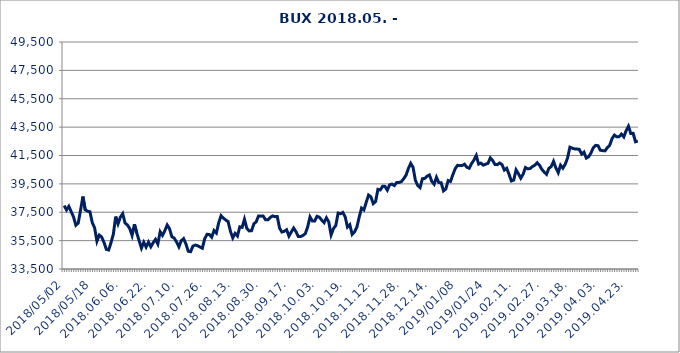
| Category | Series 0 |
|---|---|
| 2018.05.02 | 37969.837 |
| 2018.05.03 | 37660.989 |
| 2018.05.04 | 37916.311 |
| 2018.05.07 | 37541.327 |
| 2018.05.08 | 37164.546 |
| 2018.05.09 | 36588.258 |
| 2018.05.10 | 36740.211 |
| 2018.05.11 | 37644.061 |
| 2018.05.14 | 38602.887 |
| 2018.05.15 | 37663.784 |
| 2018.05.16 | 37574.99 |
| 2018.05.17 | 37538.045 |
| 2018.05.18 | 36770.927 |
| 2018.05.22 | 36400.772 |
| 2018.05.23 | 35456.518 |
| 2018.05.24 | 35892.617 |
| 2018.05.25 | 35758.06 |
| 2018.05.28 | 35373.587 |
| 2018.05.29 | 34883.939 |
| 2018.05.30 | 34837.126 |
| 2018.05.31 | 35356.826 |
| 2018.06.01. | 35952.676 |
| 2018.06.04. | 37194.372 |
| 2018.06.05. | 36677.561 |
| 2018.06.06. | 37157.464 |
| 2018.06.07. | 37401.246 |
| 2018.06.08. | 36738.315 |
| 2018.06.11. | 36606.384 |
| 2018.06.12. | 36348.106 |
| 2018.06.13. | 35868.589 |
| 2018.06.14. | 36654.567 |
| 2018.06.15. | 36038.956 |
| 2018.06.18. | 35505.465 |
| 2018.06.19. | 34972.348 |
| 2018.06.20. | 35383.574 |
| 2018.06.21. | 35049.552 |
| 2018.06.22. | 35396.618 |
| 2018.06.25. | 35064.749 |
| 2018.06.26. | 35352.026 |
| 2018.06.27. | 35587.462 |
| 2018.06.28. | 35258.852 |
| 2018.06.29. | 36127.708 |
| 2018.07.02. | 35867.746 |
| 2018.07.03. | 36204.299 |
| 2018.07.04. | 36600.249 |
| 2018.07.05. | 36335.094 |
| 2018.07.06. | 35775.734 |
| 2018.07.09. | 35676.821 |
| 2018.07.10. | 35403.198 |
| 2018.07.11. | 35063.073 |
| 2018.07.12. | 35485.868 |
| 2018.07.13. | 35641.757 |
| 2018.07.16. | 35267.069 |
| 2018.07.17. | 34751.127 |
| 2018.07.18. | 34720.307 |
| 2018.07.19. | 35117.829 |
| 2018.07.20. | 35186.519 |
| 2018.07.23. | 35141.027 |
| 2018.07.24. | 35049.71 |
| 2018.07.25. | 34963.193 |
| 2018.07.26. | 35624.912 |
| 2018.07.27. | 35943.642 |
| 2018.07.30. | 35931.234 |
| 2018.07.31. | 35742.058 |
| 2018.08.01. | 36207.717 |
| 2018.08.02. | 36035.461 |
| 2018.08.03. | 36760.004 |
| 2018.08.06. | 37259.801 |
| 2018.08.07. | 37087.753 |
| 2018.08.08. | 36954.164 |
| 2018.08.09. | 36844.993 |
| 2018.08.10. | 36171.258 |
| 2018.08.13. | 35693.828 |
| 2018.08.14. | 36006.196 |
| 2018.08.15. | 35826.141 |
| 2018.08.16. | 36472.99 |
| 2018.08.17. | 36436.959 |
| 2018.08.21. | 37007.662 |
| 2018.08.22. | 36365.904 |
| 2018.08.23. | 36186.315 |
| 2018.08.24. | 36192.132 |
| 2018.08.27. | 36685.79 |
| 2018.08.28. | 36818.931 |
| 2018.08.29. | 37234.858 |
| 2018.08.30. | 37225.076 |
| 2018.08.31. | 37233.402 |
| 2018.09.03. | 36971.856 |
| 2018.09.04. | 36968.107 |
| 2018.09.05. | 37135.328 |
| 2018.09.06. | 37241.816 |
| 2018.09.07. | 37189.976 |
| 2018.09.10. | 37202.889 |
| 2018.09.11. | 36371.943 |
| 2018.09.12. | 36104.073 |
| 2018.09.13. | 36156.035 |
| 2018.09.14. | 36269.166 |
| 2018.09.17. | 35819.9 |
| 2018.09.18. | 36110.885 |
| 2018.09.19. | 36386.403 |
| 2018.09.20. | 36134.329 |
| 2018.09.21. | 35783.48 |
| 2018.09.24. | 35786.545 |
| 2018.09.25. | 35868.88 |
| 2018.09.26. | 35996.041 |
| 2018.09.27. | 36471.348 |
| 2018.09.28. | 37171.414 |
| 2018.10.01. | 36883.492 |
| 2018.10.02. | 36876.748 |
| 2018.10.03. | 37212.945 |
| 2018.10.04. | 37146.727 |
| 2018.10.05. | 36945.25 |
| 2018.10.08. | 36768.023 |
| 2018.10.09. | 37109.241 |
| 2018.10.10. | 36821.117 |
| 2018.10.11. | 35904.542 |
| 2018.10.12. | 36347.89 |
| 2018.10.15. | 36564.15 |
| 2018.10.16. | 37445.673 |
| 2018.10.17. | 37399.11 |
| 2018.10.18. | 37485.015 |
| 2018.10.19. | 37185.929 |
| 2018.10.24. | 36452.736 |
| 2018.10.25. | 36617.542 |
| 2018.10.26. | 35937.614 |
| 2018.10.29. | 36110.122 |
| 2018.10.30. | 36444.725 |
| 2018.10.31. | 37155.206 |
| 2018.11.05. | 37794.87 |
| 2018.11.06. | 37666.001 |
| 2018.11.07. | 38197.997 |
| 2018.11.08. | 38713.446 |
| 2018.11.09. | 38586.627 |
| 2018.11.12. | 38108.455 |
| 2018.11.13. | 38252.647 |
| 2018.11.14. | 39115.558 |
| 2018.11.15. | 39070.967 |
| 2018.11.16. | 39328.386 |
| 2018.11.19. | 39323.012 |
| 2018.11.20. | 39058.304 |
| 2018.11.21. | 39431.33 |
| 2018.11.22. | 39489.376 |
| 2018.11.23. | 39379.776 |
| 2018.11.26. | 39598.286 |
| 2018.11.27. | 39601.698 |
| 2018.11.28. | 39656.246 |
| 2018.11.29. | 39861.634 |
| 2018.11.30. | 40109.366 |
| 2018.12.03. | 40579.822 |
| 2018.12.04. | 40945.474 |
| 2018.12.05. | 40670.445 |
| 2018.12.06. | 39747.127 |
| 2018.12.07. | 39384.556 |
| 2018.12.10. | 39238.436 |
| 2018.12.11. | 39860.234 |
| 2018.12.12. | 39887.22 |
| 2018.12.13. | 40041.705 |
| 2018.12.14. | 40125.722 |
| 2018.12.17. | 39675.759 |
| 2018.12.18. | 39475.607 |
| 2018.12.19. | 39966.192 |
| 2018.12.20. | 39592.675 |
| 2018.12.21. | 39578.632 |
| 2018.12.27. | 39006.517 |
| 2018.12.28. | 39138.949 |
| 2019.01.02 | 39734.064 |
| 2019.01.03 | 39672.597 |
| 2019.01.04 | 40145.177 |
| 2019.01.07 | 40569.468 |
| 2019.01.08 | 40809.819 |
| 2019.01.09 | 40784.268 |
| 2019.01.10 | 40795.505 |
| 2019.01.11 | 40886.064 |
| 2019.01.14 | 40667.654 |
| 2019.01.15 | 40600.26 |
| 2019.01.16 | 40933.043 |
| 2019.01.17 | 41180.049 |
| 2019.01.18 | 41503.905 |
| 2019.01.21 | 40893.713 |
| 2019.01.22 | 40963.712 |
| 2019.01.23 | 40818.686 |
| 2019.01.24 | 40890.939 |
| 2019.01.25 | 40944.824 |
| 2019.01.28 | 41332.315 |
| 2019.01.29 | 41146 |
| 2019.01.30 | 40862.967 |
| 2019.01.31 | 40855.561 |
| 2019.02.01. | 40973.34 |
| 2019.02.04. | 40856.968 |
| 2019.02.05. | 40474.394 |
| 2019.02.06. | 40597.263 |
| 2019.02.07. | 40173.726 |
| 2019.02.08. | 39704.61 |
| 2019.02.11. | 39769.479 |
| 2019.02.12. | 40488.09 |
| 2019.02.13. | 40221.18 |
| 2019.02.14. | 39898.653 |
| 2019.02.15. | 40179.836 |
| 2019.02.18. | 40653.387 |
| 2019.02.19. | 40560.444 |
| 2019.02.20. | 40582.832 |
| 2019.02.21. | 40721.477 |
| 2019.02.22. | 40814.595 |
| 2019.02.25. | 40987.946 |
| 2019.02.26. | 40819.081 |
| 2019.02.27. | 40525.284 |
| 2019.02.28. | 40333.039 |
| 2019.03.01. | 40170.655 |
| 2019.03.04. | 40593.477 |
| 2019.03.05. | 40718.497 |
| 2019.03.06. | 41086.897 |
| 2019.03.07. | 40625.302 |
| 2019.03.08. | 40288.437 |
| 2019.03.11. | 40819.551 |
| 2019.03.12. | 40612.503 |
| 2019.03.13. | 40887.578 |
| 2019.03.14. | 41335.024 |
| 2019.03.18. | 42085.013 |
| 2019.03.19. | 42014.162 |
| 2019.03.20. | 41964.35 |
| 2019.03.21. | 41955.752 |
| 2019.03.22. | 41931.67 |
| 2019.03.25. | 41605.172 |
| 2019.03.26. | 41740.966 |
| 2019.03.27. | 41316.196 |
| 2019.03.28. | 41413.909 |
| 2019.03.29. | 41683.78 |
| 2019.04.01. | 42057.333 |
| 2019.04.02. | 42213.346 |
| 2019.04.03. | 42193.967 |
| 2019.04.04. | 41870.438 |
| 2019.04.05. | 41841.921 |
| 2019.04.08. | 41826.902 |
| 2019.04.09. | 42063.939 |
| 2019.04.10. | 42225.867 |
| 2019.04.11. | 42693.515 |
| 2019.04.12. | 42940.74 |
| 2019.04.15. | 42815.922 |
| 2019.04.16. | 42826.299 |
| 2019.04.17. | 43004.506 |
| 2019.04.18. | 42810.106 |
| 2019.04.23. | 43245.434 |
| 2019.04.24. | 43563.383 |
| 2019.04.25. | 43053.87 |
| 2019.04.26. | 43064.395 |
| 2019.04.29. | 42469.842 |
| 2019.04.30. | 42520.113 |